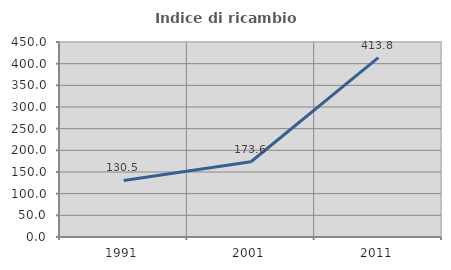
| Category | Indice di ricambio occupazionale  |
|---|---|
| 1991.0 | 130.508 |
| 2001.0 | 173.636 |
| 2011.0 | 413.793 |